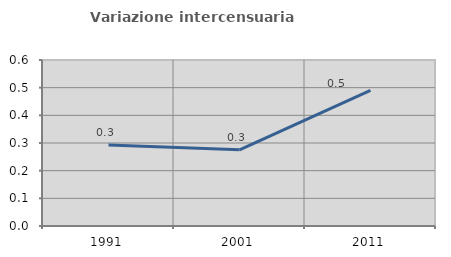
| Category | Variazione intercensuaria annua |
|---|---|
| 1991.0 | 0.293 |
| 2001.0 | 0.275 |
| 2011.0 | 0.49 |